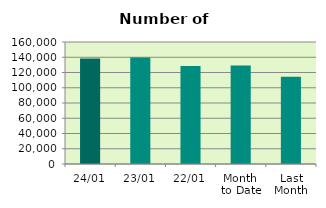
| Category | Series 0 |
|---|---|
| 24/01 | 138230 |
| 23/01 | 139824 |
| 22/01 | 128614 |
| Month 
to Date | 129044.235 |
| Last
Month | 114459.3 |